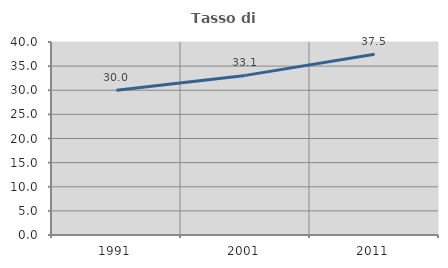
| Category | Tasso di occupazione   |
|---|---|
| 1991.0 | 30.006 |
| 2001.0 | 33.08 |
| 2011.0 | 37.474 |